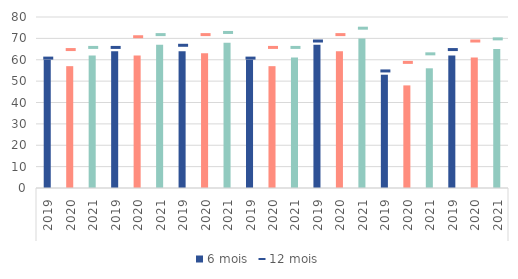
| Category | 6 mois |
|---|---|
| 0 | 60 |
| 1 | 57 |
| 2 | 62 |
| 3 | 64 |
| 4 | 62 |
| 5 | 67 |
| 6 | 64 |
| 7 | 63 |
| 8 | 68 |
| 9 | 60 |
| 10 | 57 |
| 11 | 61 |
| 12 | 67 |
| 13 | 64 |
| 14 | 70 |
| 15 | 53 |
| 16 | 48 |
| 17 | 56 |
| 18 | 62 |
| 19 | 61 |
| 20 | 65 |